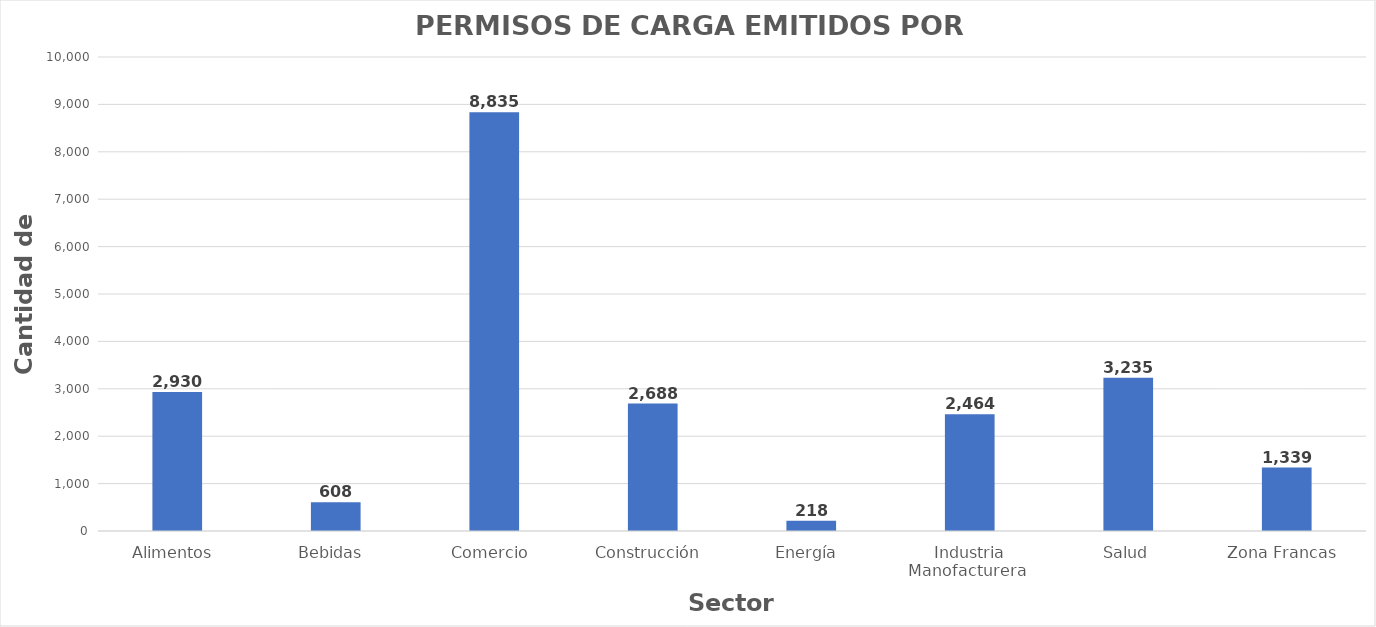
| Category | Series 0 |
|---|---|
| Alimentos  | 2930 |
| Bebidas  | 608 |
| Comercio  | 8835 |
| Construcción  | 2688 |
| Energía  | 218 |
| Industria Manofacturera  | 2464 |
| Salud | 3235 |
| Zona Francas  | 1339 |